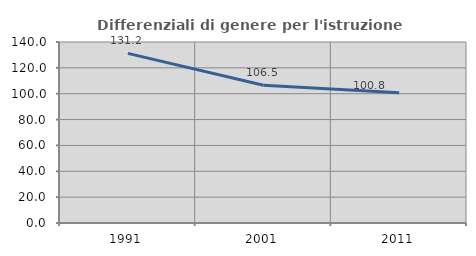
| Category | Differenziali di genere per l'istruzione superiore |
|---|---|
| 1991.0 | 131.227 |
| 2001.0 | 106.504 |
| 2011.0 | 100.788 |